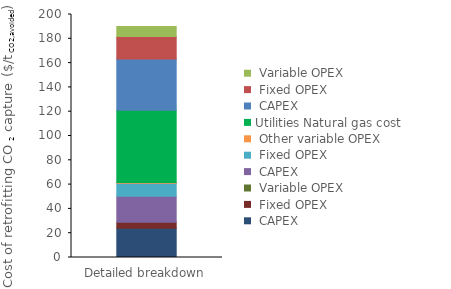
| Category | Interconnecting | Utilities | Series 0 | Series 1 | Series 2 |
|---|---|---|---|---|---|
| 0 | 0 | 59.444 | 42.213 | 18.46 | 8.273 |